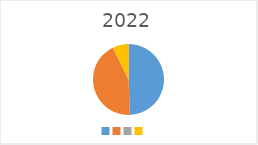
| Category | Series 0 |
|---|---|
|  | 163000 |
|  | 143000 |
|  | 0 |
|  | 24000 |